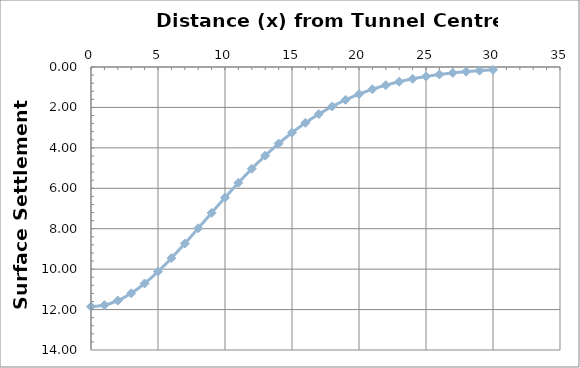
| Category | Series 0 |
|---|---|
| 0.0 | 11.856 |
| 1.0 | 11.78 |
| 2.0 | 11.556 |
| 3.0 | 11.193 |
| 4.0 | 10.708 |
| 5.0 | 10.121 |
| 6.0 | 9.455 |
| 7.0 | 8.733 |
| 8.0 | 7.979 |
| 9.0 | 7.215 |
| 10.0 | 6.46 |
| 11.0 | 5.729 |
| 12.0 | 5.035 |
| 13.0 | 4.386 |
| 14.0 | 3.79 |
| 15.0 | 3.248 |
| 16.0 | 2.762 |
| 17.0 | 2.331 |
| 18.0 | 1.954 |
| 19.0 | 1.625 |
| 20.0 | 1.343 |
| 21.0 | 1.102 |
| 22.0 | 0.898 |
| 23.0 | 0.728 |
| 24.0 | 0.585 |
| 25.0 | 0.468 |
| 26.0 | 0.372 |
| 27.0 | 0.293 |
| 28.0 | 0.23 |
| 29.0 | 0.179 |
| 30.0 | 0.139 |